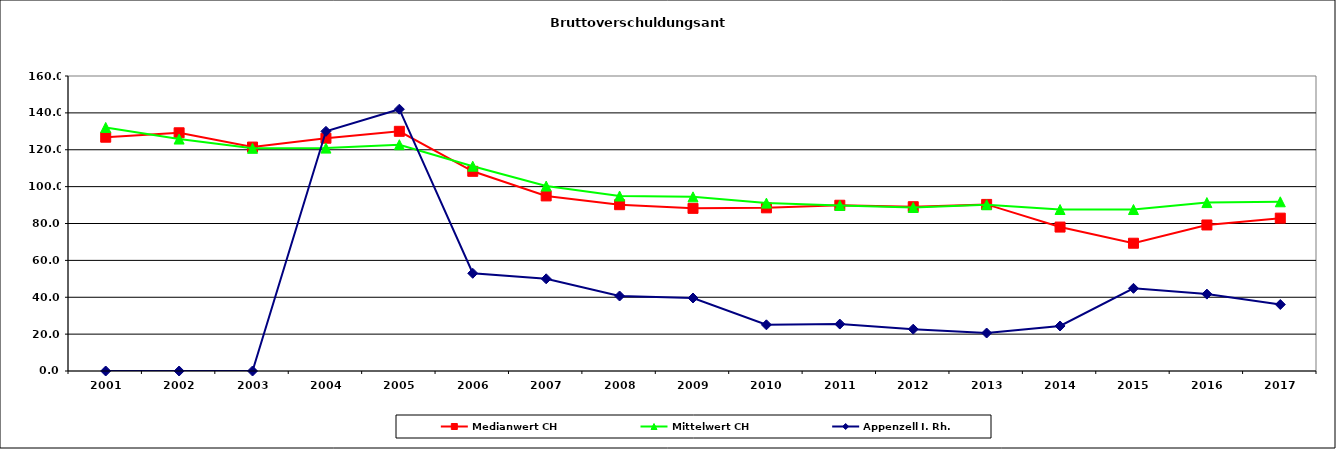
| Category | Medianwert CH | Mittelwert CH | Appenzell I. Rh. |
|---|---|---|---|
| 2001.0 | 126.8 | 132.1 | 0 |
| 2002.0 | 129.2 | 125.8 | 0 |
| 2003.0 | 121.45 | 120.775 | 0 |
| 2004.0 | 126.25 | 120.889 | 130 |
| 2005.0 | 130 | 122.728 | 142 |
| 2006.0 | 108.3 | 111.087 | 53 |
| 2007.0 | 94.96 | 100.307 | 50 |
| 2008.0 | 90.2 | 94.911 | 40.67 |
| 2009.0 | 88.22 | 94.453 | 39.6 |
| 2010.0 | 88.5 | 91.058 | 25.05 |
| 2011.0 | 89.9 | 89.805 | 25.45 |
| 2012.0 | 89.11 | 88.689 | 22.68 |
| 2013.0 | 90.35 | 90.167 | 20.6 |
| 2014.0 | 78.06 | 87.587 | 24.41 |
| 2015.0 | 69.3 | 87.576 | 44.84 |
| 2016.0 | 79.2 | 91.353 | 41.7 |
| 2017.0 | 82.9 | 91.779 | 36.06 |